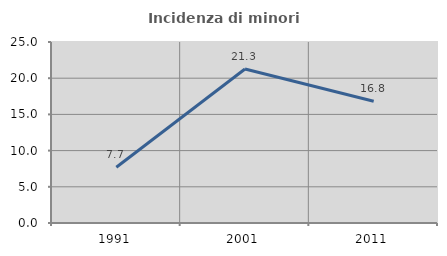
| Category | Incidenza di minori stranieri |
|---|---|
| 1991.0 | 7.692 |
| 2001.0 | 21.277 |
| 2011.0 | 16.807 |